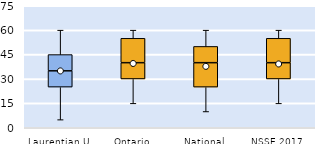
| Category | 25th | 50th | 75th |
|---|---|---|---|
| Laurentian U | 25 | 10 | 10 |
| Ontario | 30 | 10 | 15 |
| National | 25 | 15 | 10 |
| NSSE 2017 | 30 | 10 | 15 |